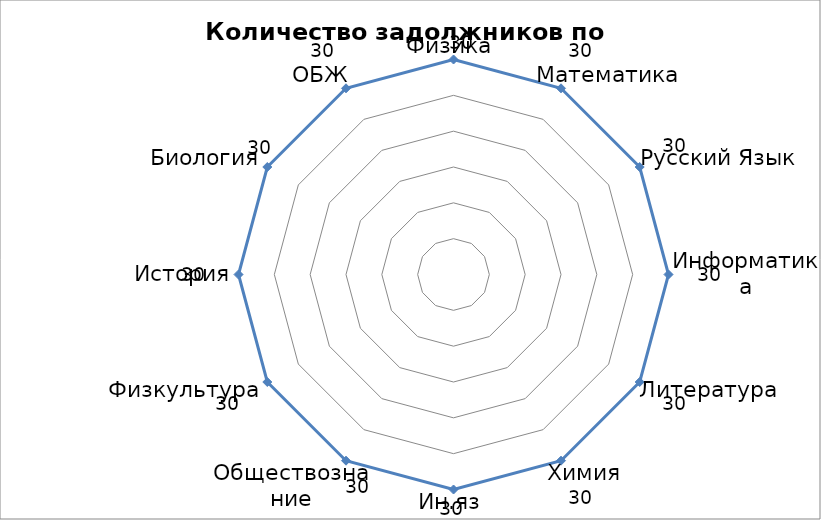
| Category | Количество задолжников |
|---|---|
| Физика | 30 |
| Математика | 30 |
| Русский Язык  | 30 |
| Информатика | 30 |
| Литература | 30 |
| Химия | 30 |
| Ин.яз | 30 |
| Обществознание | 30 |
| Физкультура | 30 |
| История | 30 |
| Биология | 30 |
| ОБЖ | 30 |